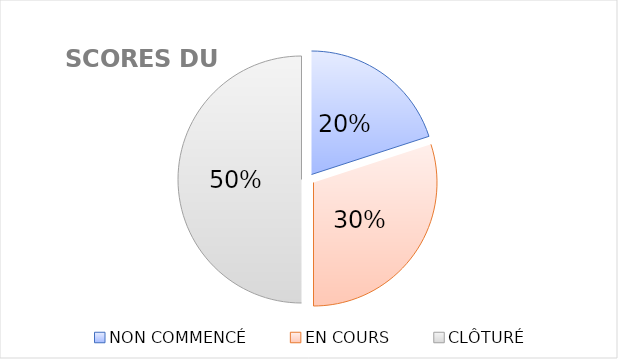
| Category | Series 0 |
|---|---|
| NON COMMENCÉ | 2 |
| EN COURS | 3 |
| CLÔTURÉ | 5 |